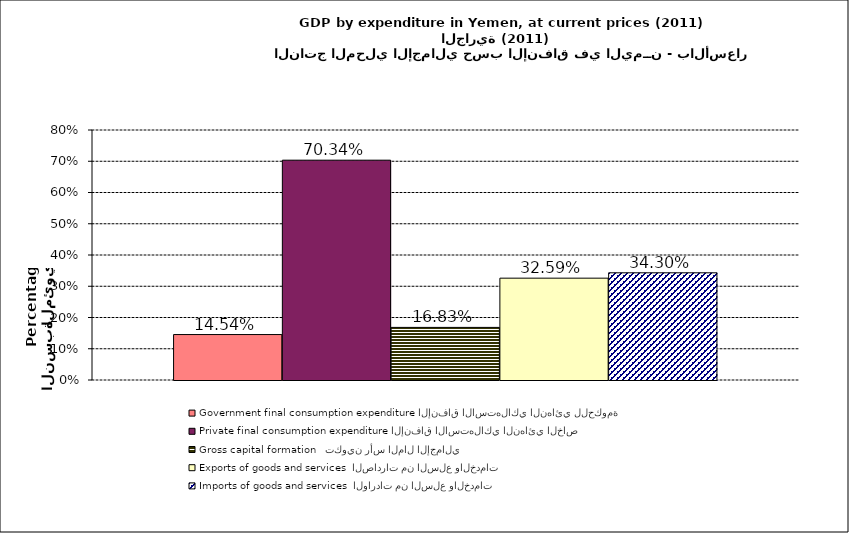
| Category | Government final consumption expenditure الإنفاق الاستهلاكي النهائي للحكومة | Private final consumption expenditure الإنفاق الاستهلاكي النهائي الخاص | Gross capital formation   تكوين رأس المال الإجمالي | Exports of goods and services  الصادرات من السلع والخدمات | Imports of goods and services  الواردات من السلع والخدمات |
|---|---|---|---|---|---|
| 0 | 0.145 | 0.703 | 0.168 | 0.326 | 0.343 |